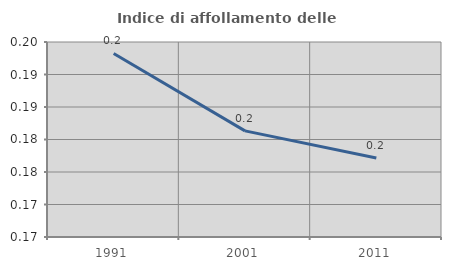
| Category | Indice di affollamento delle abitazioni  |
|---|---|
| 1991.0 | 0.193 |
| 2001.0 | 0.181 |
| 2011.0 | 0.177 |